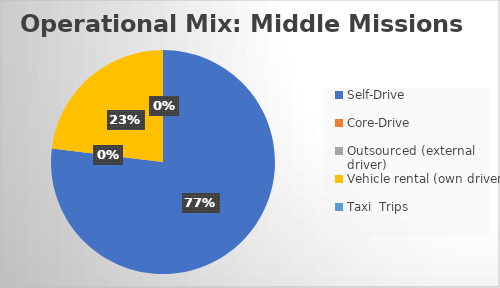
| Category | Series 0 |
|---|---|
| Self-Drive | 10 |
| Core-Drive | 0 |
| Outsourced (external driver) | 0 |
| Vehicle rental (own driver) | 3 |
| Taxi  Trips | 0 |